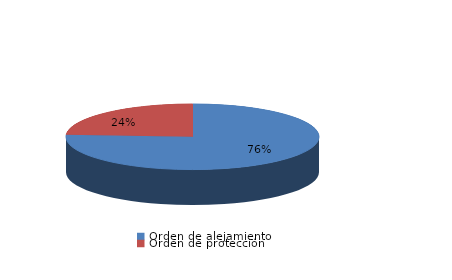
| Category | Series 0 |
|---|---|
| Orden de alejamiento | 19 |
| Orden de protección | 6 |